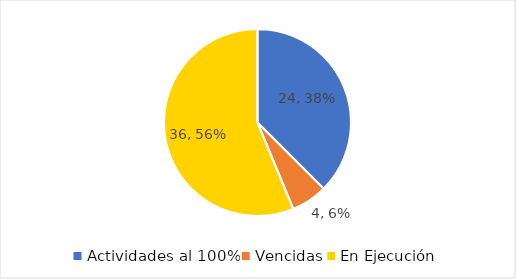
| Category | Series 0 |
|---|---|
| Actividades al 100% | 24 |
| Vencidas | 4 |
| En Ejecución | 36 |